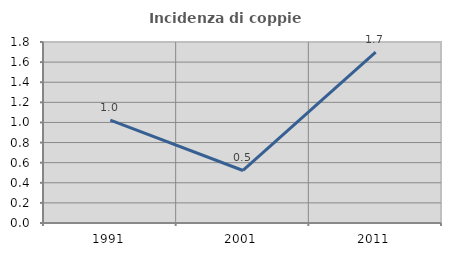
| Category | Incidenza di coppie miste |
|---|---|
| 1991.0 | 1.024 |
| 2001.0 | 0.522 |
| 2011.0 | 1.699 |